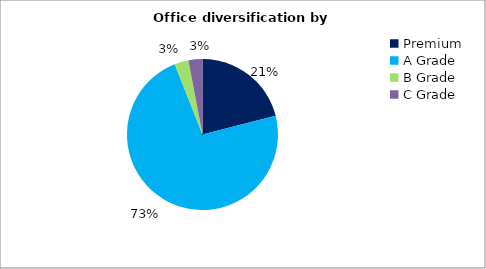
| Category | Series 0 |
|---|---|
| Premium | 0.21 |
| A Grade | 0.73 |
| B Grade | 0.03 |
| C Grade | 0.03 |